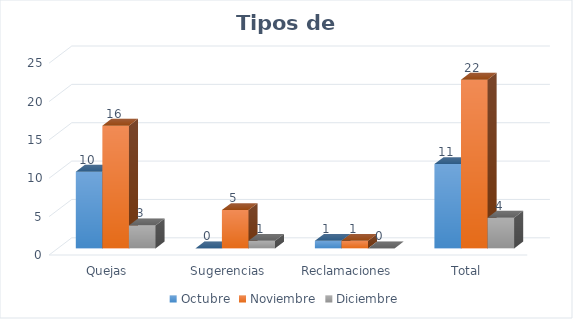
| Category | Octubre | Noviembre | Diciembre |
|---|---|---|---|
| Quejas | 10 | 16 | 3 |
| Sugerencias | 0 | 5 | 1 |
| Reclamaciones | 1 | 1 | 0 |
| Total | 11 | 22 | 4 |